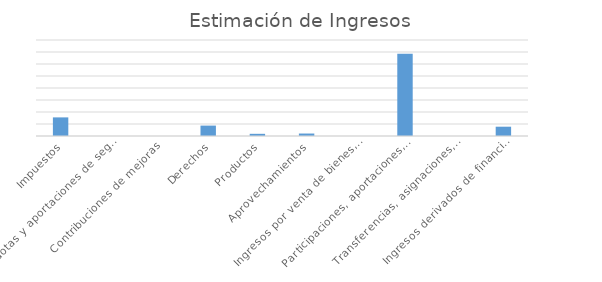
| Category | Series 0 |
|---|---|
| Impuestos | 77564693 |
| Cuotas y aportaciones de seguridad social | 0 |
| Contribuciones de mejoras | 0 |
| Derechos | 43315170 |
| Productos | 9097655 |
| Aprovechamientos | 10280197 |
| Ingresos por venta de bienes, prestación de servicios y otros ingresos | 0 |
| Participaciones, aportaciones, convenios, incentivos derivados de la colaboración fiscal y fondos distitntos de las aportaciones | 342407367 |
| Transferencias, asignaciones, subsidios y subvenciones y pensiones y jubilaciones | 0 |
| Ingresos derivados de financiamiento | 38752821 |